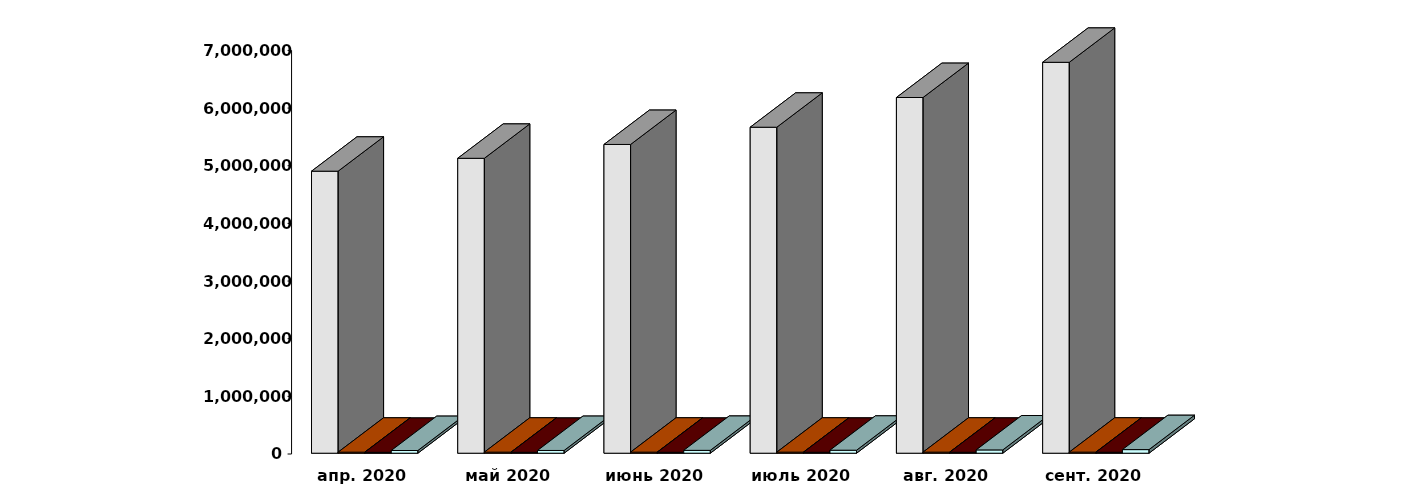
| Category | Физические лица | Юридические лица | Иностранные лица | Клиенты, передавшие свои средства в ДУ |
|---|---|---|---|---|
| 2020-04-30 | 4891213 | 18138 | 15242 | 46759 |
| 2020-05-30 | 5114736 | 18257 | 15483 | 47445 |
| 2020-06-30 | 5354906 | 18261 | 15817 | 49363 |
| 2020-07-30 | 5653690 | 18250 | 16100 | 51872 |
| 2020-08-30 | 6169141 | 18285 | 16204 | 57089 |
| 2020-09-30 | 6779757 | 18484 | 16494 | 62564 |